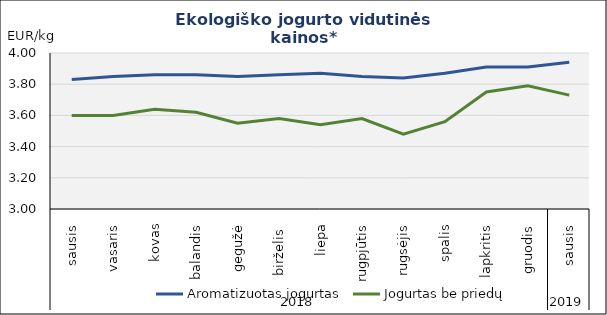
| Category | Aromatizuotas jogurtas | Jogurtas be priedų |
|---|---|---|
| 0 | 3.83 | 3.6 |
| 1 | 3.85 | 3.6 |
| 2 | 3.86 | 3.64 |
| 3 | 3.86 | 3.62 |
| 4 | 3.85 | 3.55 |
| 5 | 3.86 | 3.58 |
| 6 | 3.87 | 3.54 |
| 7 | 3.85 | 3.58 |
| 8 | 3.84 | 3.48 |
| 9 | 3.87 | 3.56 |
| 10 | 3.91 | 3.75 |
| 11 | 3.91 | 3.79 |
| 12 | 3.94 | 3.73 |